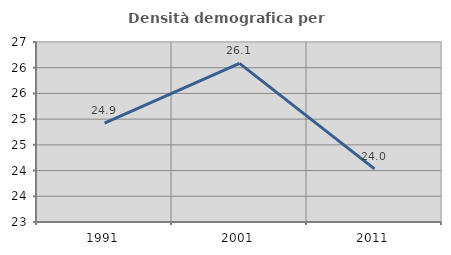
| Category | Densità demografica |
|---|---|
| 1991.0 | 24.92 |
| 2001.0 | 26.084 |
| 2011.0 | 24.033 |